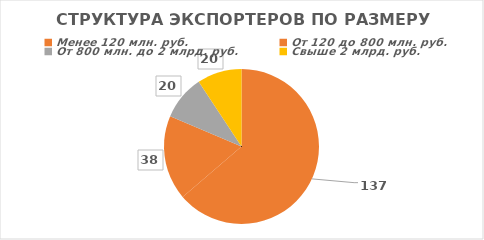
| Category | Итог |
|---|---|
| Менее 120 млн. руб. | 137 |
| От 120 до 800 млн. руб. | 38 |
| От 800 млн. до 2 млрд. руб. | 20 |
| Свыше 2 млрд. руб. | 20 |